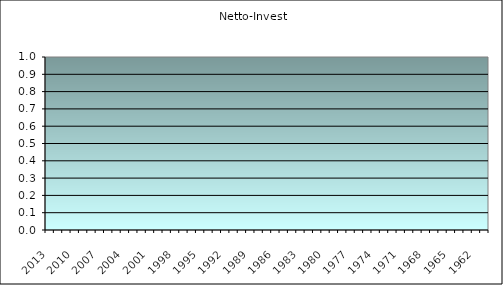
| Category | Netto-Invest |
|---|---|
| 2013 | 0 |
| 2012 | 0 |
| 2011 | 0 |
| 2010 | 0 |
| 2009 | 0 |
| 2008 | 0 |
| 2007 | 0 |
| 2006 | 0 |
| 2005 | 0 |
| 2004 | 0 |
| 2003 | 0 |
| 2002 | 0 |
| 2001 | 0 |
| 2000 | 0 |
| 1999 | 0 |
| 1998 | 0 |
| 1997 | 0 |
| 1996 | 0 |
| 1995 | 0 |
| 1994 | 0 |
| 1993 | 0 |
| 1992 | 0 |
| 1991 | 0 |
| 1990 | 0 |
| 1989 | 0 |
| 1988 | 0 |
| 1987 | 0 |
| 1986 | 0 |
| 1985 | 0 |
| 1984 | 0 |
| 1983 | 0 |
| 1982 | 0 |
| 1981 | 0 |
| 1980 | 0 |
| 1979 | 0 |
| 1978 | 0 |
| 1977 | 0 |
| 1976 | 0 |
| 1975 | 0 |
| 1974 | 0 |
| 1973 | 0 |
| 1972 | 0 |
| 1971 | 0 |
| 1970 | 0 |
| 1969 | 0 |
| 1968 | 0 |
| 1967 | 0 |
| 1966 | 0 |
| 1965 | 0 |
| 1964 | 0 |
| 1963 | 0 |
| 1962 | 0 |
| älter | 0 |